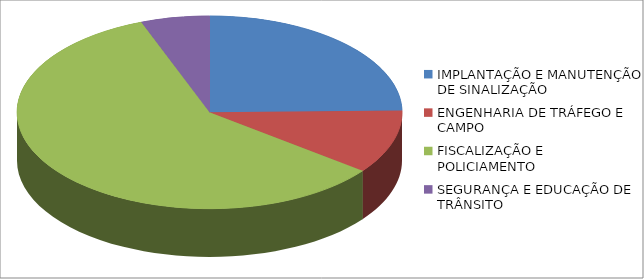
| Category | Series 0 | Series 1 |
|---|---|---|
| IMPLANTAÇÃO E MANUTENÇÃO DE SINALIZAÇÃO | 1298857.94 |  |
| ENGENHARIA DE TRÁFEGO E CAMPO | 561499.82 |  |
| FISCALIZAÇÃO E POLICIAMENTO | 3095289.36 |  |
| SEGURANÇA E EDUCAÇÃO DE TRÂNSITO | 302804.39 |  |